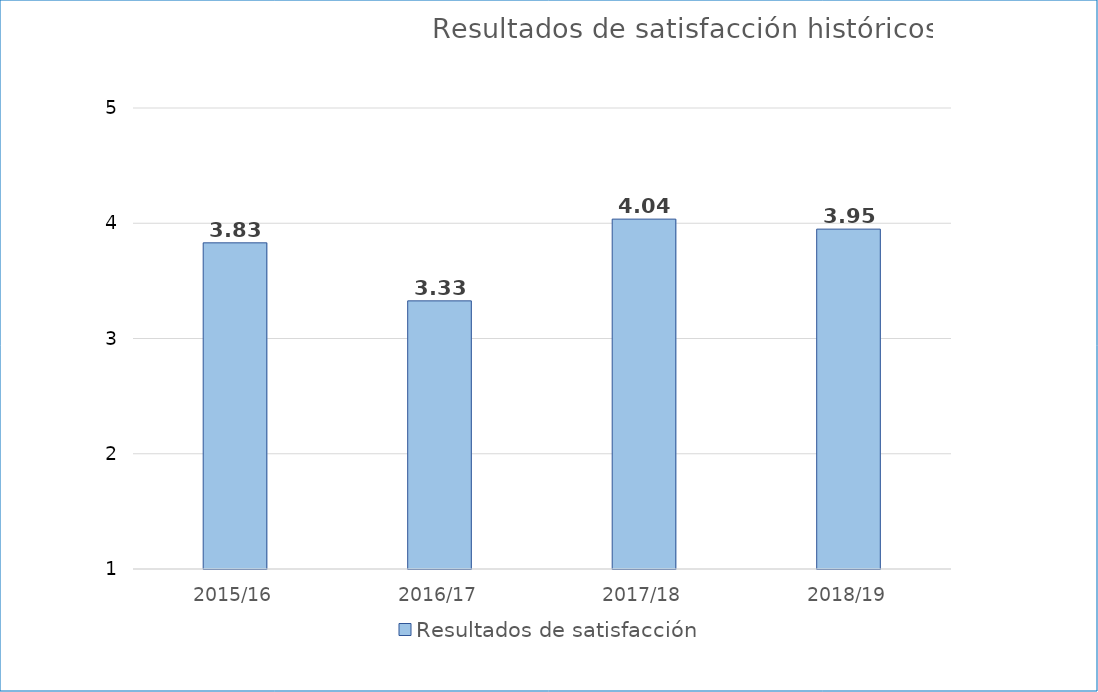
| Category | Resultados de satisfacción |
|---|---|
| 2015/16 | 3.83 |
| 2016/17 | 3.326 |
| 2017/18 | 4.036 |
| 2018/19 | 3.949 |